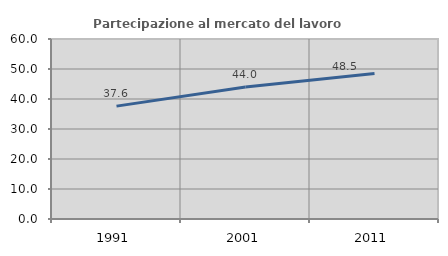
| Category | Partecipazione al mercato del lavoro  femminile |
|---|---|
| 1991.0 | 37.629 |
| 2001.0 | 44.025 |
| 2011.0 | 48.488 |